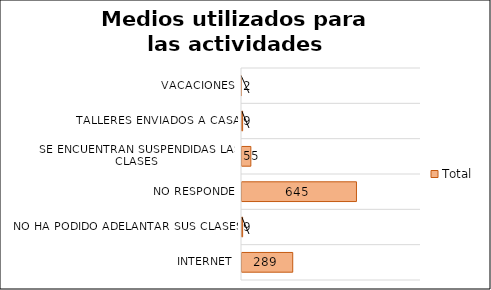
| Category | Total |
|---|---|
| Internet | 289 |
| No ha podido adelantar sus clases | 9 |
| No responde | 645 |
| Se encuentran suspendidas las clases | 55 |
| Talleres enviados a casa | 9 |
| Vacaciones | 2 |